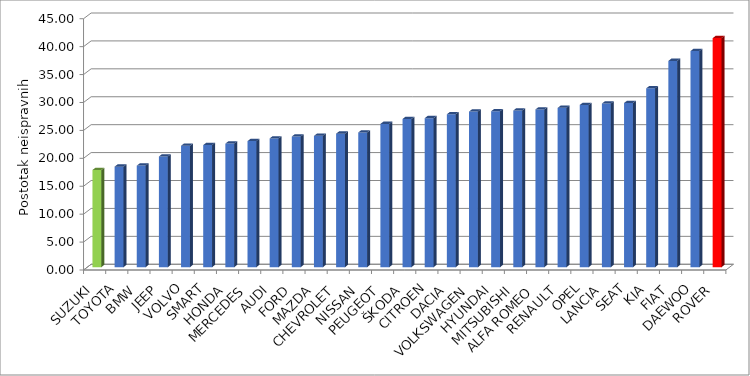
| Category | Series 4 |
|---|---|
| SUZUKI | 17.401 |
| TOYOTA | 18.001 |
| BMW | 18.182 |
| JEEP | 19.82 |
| VOLVO | 21.746 |
| SMART | 21.865 |
| HONDA | 22.129 |
| MERCEDES | 22.574 |
| AUDI | 23.054 |
| FORD | 23.403 |
| MAZDA | 23.517 |
| CHEVROLET | 23.912 |
| NISSAN | 24.126 |
| PEUGEOT | 25.652 |
| ŠKODA | 26.543 |
| CITROEN | 26.686 |
| DACIA | 27.387 |
| VOLKSWAGEN | 27.865 |
| HYUNDAI | 27.924 |
| MITSUBISHI | 28.064 |
| ALFA ROMEO | 28.247 |
| RENAULT | 28.528 |
| OPEL | 29.05 |
| LANCIA | 29.303 |
| SEAT | 29.403 |
| KIA | 32.029 |
| FIAT | 36.937 |
| DAEWOO | 38.702 |
| ROVER | 41.016 |